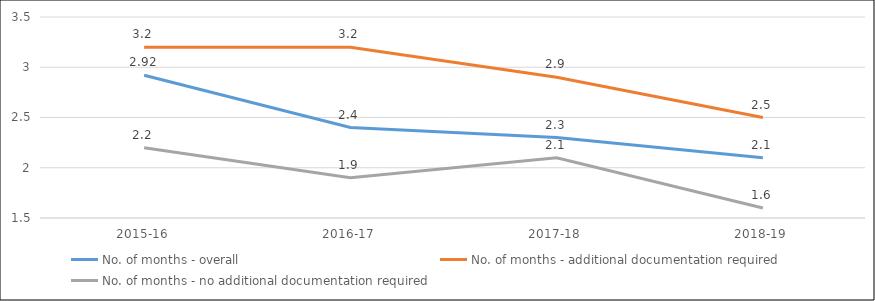
| Category | No. of months - overall | No. of months - additional documentation required | No. of months - no additional documentation required |
|---|---|---|---|
| 2015-16 | 2.92 | 3.2 | 2.2 |
| 2016-17 | 2.4 | 3.2 | 1.9 |
| 2017-18 | 2.3 | 2.9 | 2.1 |
| 2018-19 | 2.1 | 2.5 | 1.6 |